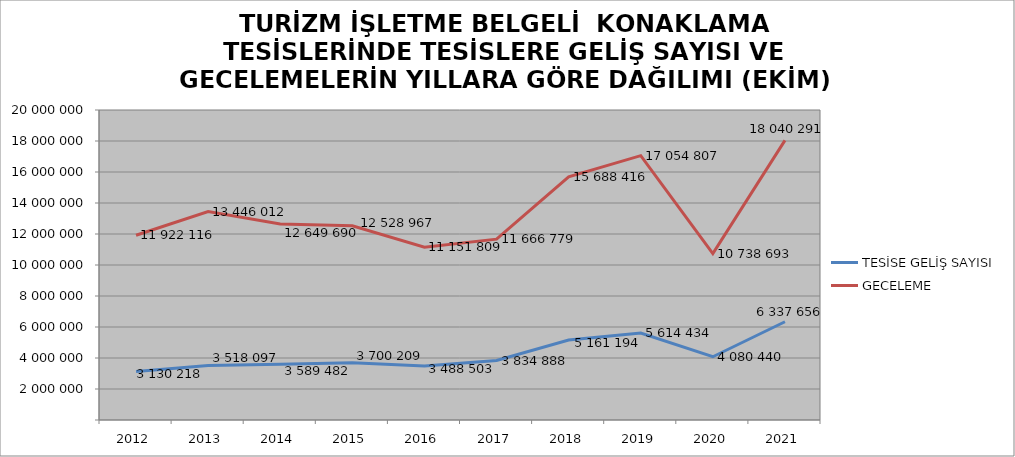
| Category | TESİSE GELİŞ SAYISI | GECELEME |
|---|---|---|
| 2012 | 3130218 | 11922116 |
| 2013 | 3518097 | 13446012 |
| 2014 | 3589482 | 12649690 |
| 2015 | 3700209 | 12528967 |
| 2016 | 3488503 | 11151809 |
| 2017 | 3834888 | 11666779 |
| 2018 | 5161194 | 15688416 |
| 2019 | 5614434 | 17054807 |
| 2020 | 4080440 | 10738693 |
| 2021 | 6337656 | 18040291 |